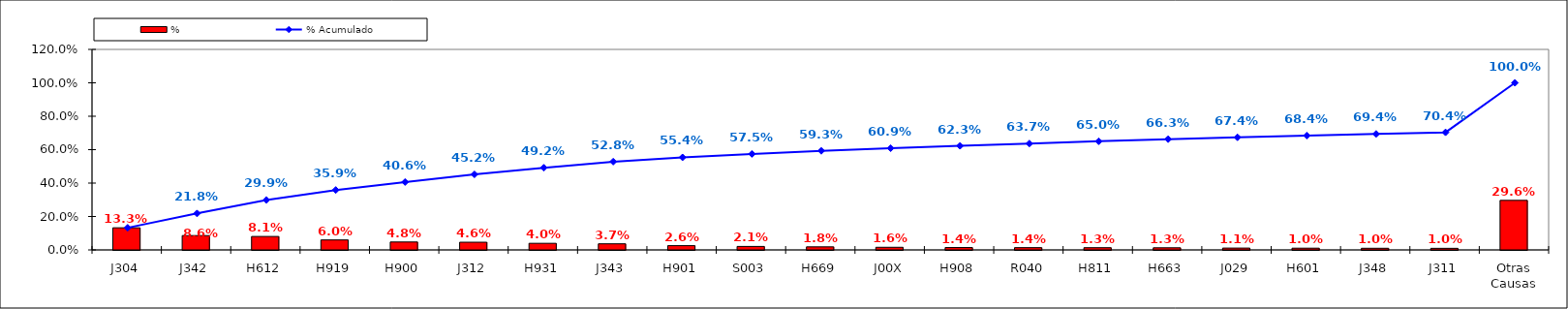
| Category | % |
|---|---|
| J304 | 0.133 |
| J342 | 0.086 |
| H612 | 0.081 |
| H919 | 0.06 |
| H900 | 0.048 |
| J312 | 0.046 |
| H931 | 0.04 |
| J343 | 0.037 |
| H901 | 0.026 |
| S003 | 0.021 |
| H669 | 0.018 |
| J00X | 0.016 |
| H908 | 0.014 |
| R040 | 0.014 |
| H811 | 0.013 |
| H663 | 0.013 |
| J029 | 0.011 |
| H601 | 0.01 |
| J348 | 0.01 |
| J311 | 0.01 |
| Otras Causas | 0.296 |